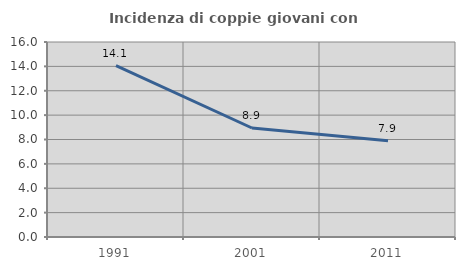
| Category | Incidenza di coppie giovani con figli |
|---|---|
| 1991.0 | 14.067 |
| 2001.0 | 8.943 |
| 2011.0 | 7.907 |